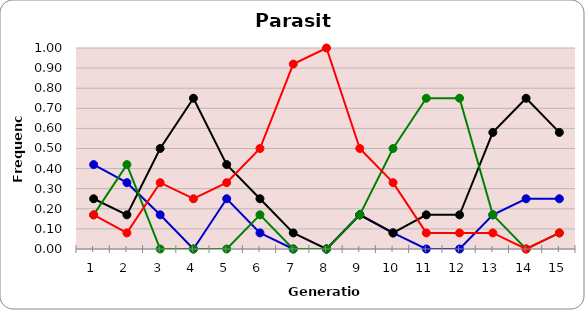
| Category | Sp | Cl | Di | He |
|---|---|---|---|---|
| 1.0 | 0.42 | 0.25 | 0.17 | 0.17 |
| 2.0 | 0.33 | 0.17 | 0.42 | 0.08 |
| 3.0 | 0.17 | 0.5 | 0 | 0.33 |
| 4.0 | 0 | 0.75 | 0 | 0.25 |
| 5.0 | 0.25 | 0.42 | 0 | 0.33 |
| 6.0 | 0.08 | 0.25 | 0.17 | 0.5 |
| 7.0 | 0 | 0.08 | 0 | 0.92 |
| 8.0 | 0 | 0 | 0 | 1 |
| 9.0 | 0.17 | 0.17 | 0.17 | 0.5 |
| 10.0 | 0.08 | 0.08 | 0.5 | 0.33 |
| 11.0 | 0 | 0.17 | 0.75 | 0.08 |
| 12.0 | 0 | 0.17 | 0.75 | 0.08 |
| 13.0 | 0.17 | 0.58 | 0.17 | 0.08 |
| 14.0 | 0.25 | 0.75 | 0 | 0 |
| 15.0 | 0.25 | 0.58 | 0.08 | 0.08 |